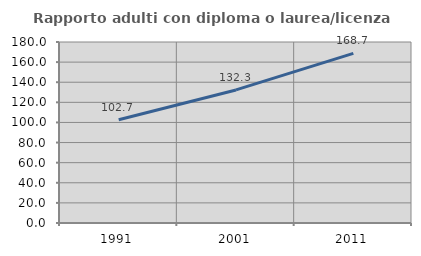
| Category | Rapporto adulti con diploma o laurea/licenza media  |
|---|---|
| 1991.0 | 102.683 |
| 2001.0 | 132.341 |
| 2011.0 | 168.657 |